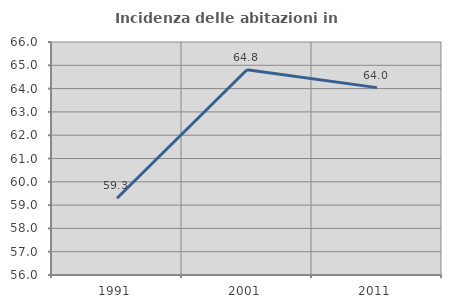
| Category | Incidenza delle abitazioni in proprietà  |
|---|---|
| 1991.0 | 59.292 |
| 2001.0 | 64.807 |
| 2011.0 | 64.042 |